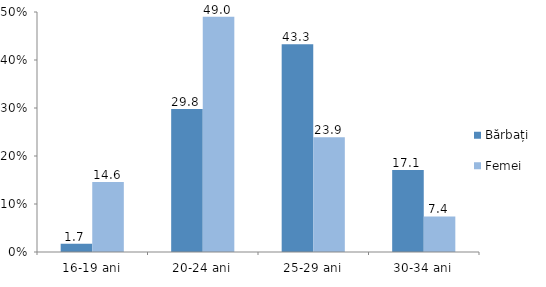
| Category | Bărbați | Femei |
|---|---|---|
| 16-19 ani | 1.7 | 14.6 |
| 20-24 ani | 29.8 | 49 |
| 25-29 ani | 43.3 | 23.9 |
| 30-34 ani | 17.1 | 7.4 |